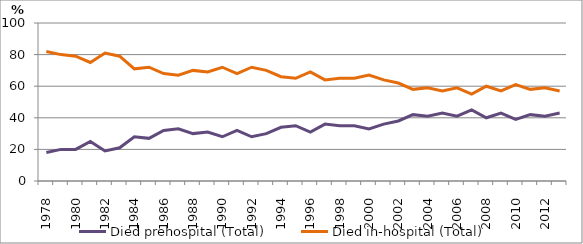
| Category | Died prehospital (Total) | Died in-hospital (Total) |
|---|---|---|
| 1978.0 | 18 | 82 |
| 1979.0 | 20 | 80 |
| 1980.0 | 20 | 79 |
| 1981.0 | 25 | 75 |
| 1982.0 | 19 | 81 |
| 1983.0 | 21 | 79 |
| 1984.0 | 28 | 71 |
| 1985.0 | 27 | 72 |
| 1986.0 | 32 | 68 |
| 1987.0 | 33 | 67 |
| 1988.0 | 30 | 70 |
| 1989.0 | 31 | 69 |
| 1990.0 | 28 | 72 |
| 1991.0 | 32 | 68 |
| 1992.0 | 28 | 72 |
| 1993.0 | 30 | 70 |
| 1994.0 | 34 | 66 |
| 1995.0 | 35 | 65 |
| 1996.0 | 31 | 69 |
| 1997.0 | 36 | 64 |
| 1998.0 | 35 | 65 |
| 1999.0 | 35 | 65 |
| 2000.0 | 33 | 67 |
| 2001.0 | 36 | 64 |
| 2002.0 | 38 | 62 |
| 2003.0 | 42 | 58 |
| 2004.0 | 41 | 59 |
| 2005.0 | 43 | 57 |
| 2006.0 | 41 | 59 |
| 2007.0 | 45 | 55 |
| 2008.0 | 40 | 60 |
| 2009.0 | 43 | 57 |
| 2010.0 | 39 | 61 |
| 2011.0 | 42 | 58 |
| 2012.0 | 41 | 59 |
| 2013.0 | 43 | 57 |